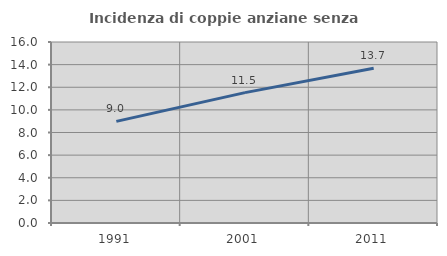
| Category | Incidenza di coppie anziane senza figli  |
|---|---|
| 1991.0 | 8.982 |
| 2001.0 | 11.524 |
| 2011.0 | 13.678 |